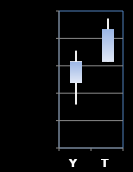
| Category | Series 0 | Series 1 | Series 2 | Series 3 |
|---|---|---|---|---|
| Y | 110.188 | 110.211 | 110.172 | 110.203 |
| T | 110.203 | 110.234 | 110.203 | 110.227 |